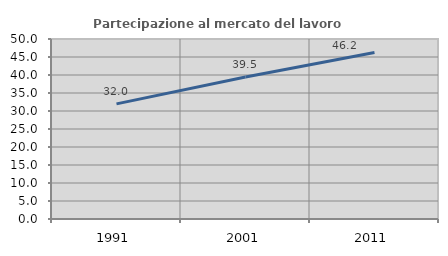
| Category | Partecipazione al mercato del lavoro  femminile |
|---|---|
| 1991.0 | 31.977 |
| 2001.0 | 39.459 |
| 2011.0 | 46.234 |